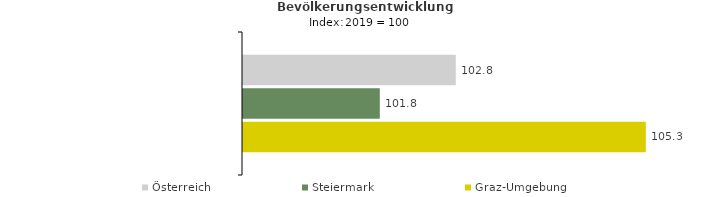
| Category | Österreich | Steiermark | Graz-Umgebung |
|---|---|---|---|
| 2023.0 | 102.8 | 101.8 | 105.3 |